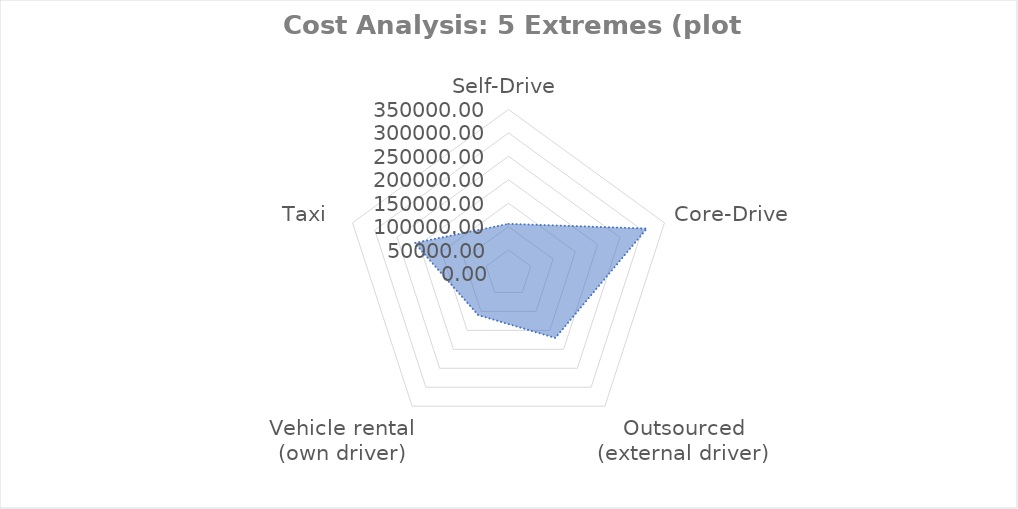
| Category | Series 0 |
|---|---|
| Self-Drive | 105961.721 |
| Core-Drive | 310480.463 |
| Outsourced (external driver) | 170000 |
| Vehicle rental (own driver) | 109837.5 |
| Taxi  | 210630 |